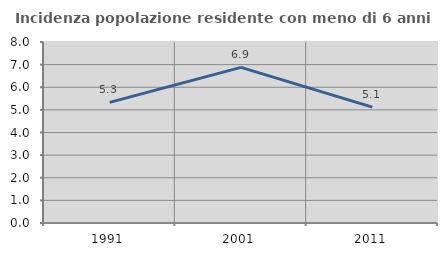
| Category | Incidenza popolazione residente con meno di 6 anni |
|---|---|
| 1991.0 | 5.332 |
| 2001.0 | 6.879 |
| 2011.0 | 5.119 |